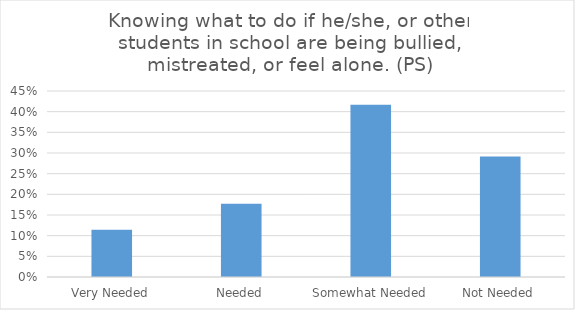
| Category | Knowing what to do if he/she, or other students in school are being bullied, mistreated, or feel alone. (PS) |
|---|---|
| Very Needed | 0.115 |
| Needed | 0.177 |
| Somewhat Needed | 0.417 |
| Not Needed | 0.292 |